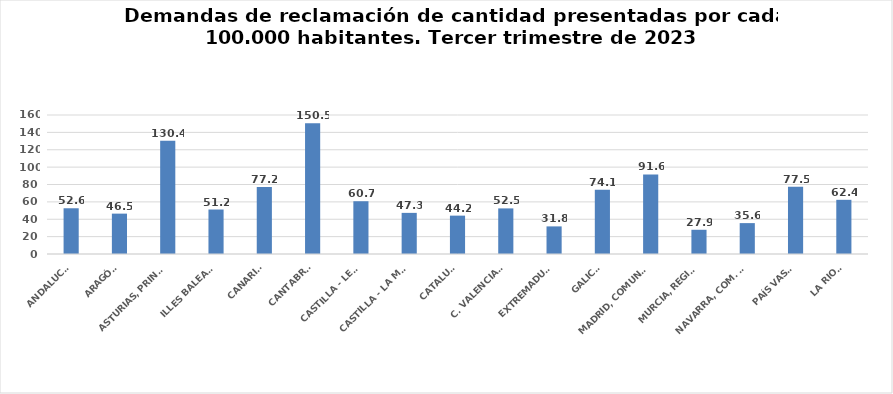
| Category | Series 0 |
|---|---|
| ANDALUCÍA | 52.646 |
| ARAGÓN | 46.468 |
| ASTURIAS, PRINCIPADO | 130.438 |
| ILLES BALEARS | 51.213 |
| CANARIAS | 77.229 |
| CANTABRIA | 150.545 |
| CASTILLA - LEÓN | 60.733 |
| CASTILLA - LA MANCHA | 47.342 |
| CATALUÑA | 44.157 |
| C. VALENCIANA | 52.489 |
| EXTREMADURA | 31.774 |
| GALICIA | 74.082 |
| MADRID, COMUNIDAD | 91.634 |
| MURCIA, REGIÓN | 27.887 |
| NAVARRA, COM. FORAL | 35.555 |
| PAÍS VASCO | 77.526 |
| LA RIOJA | 62.371 |